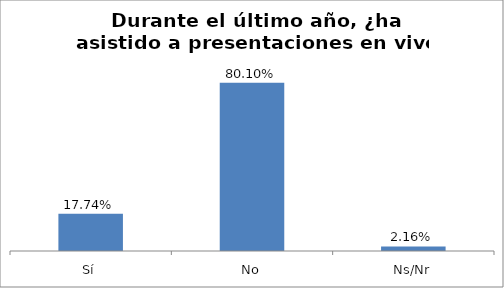
| Category | Total |
|---|---|
| Sí | 0.177 |
| No | 0.801 |
| Ns/Nr | 0.022 |